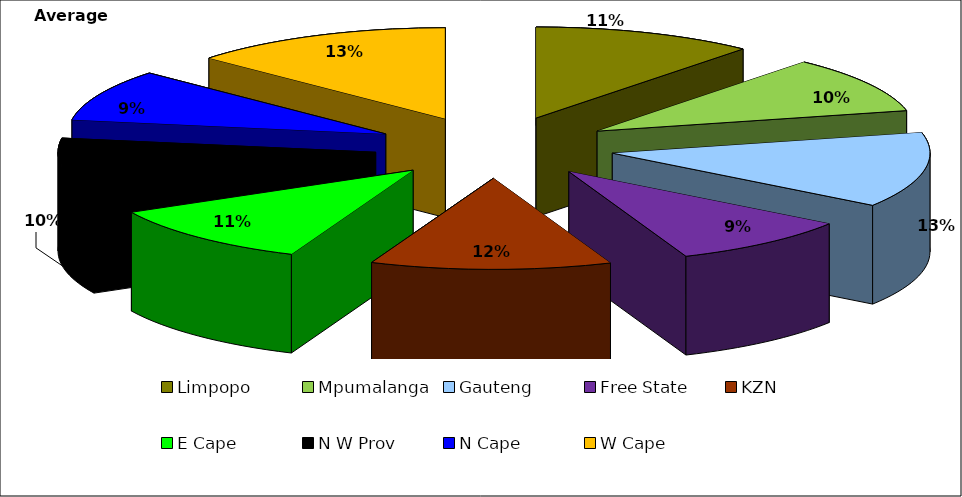
| Category | Average 1996 |
|---|---|
| Limpopo | 162730.9 |
| Mpumalanga | 145293.35 |
| Gauteng | 192091.6 |
| Free State | 133658.475 |
| KZN | 176761.7 |
| E Cape | 159762.1 |
| N W Prov | 146049.2 |
| N Cape | 131930 |
| W Cape | 192415.95 |